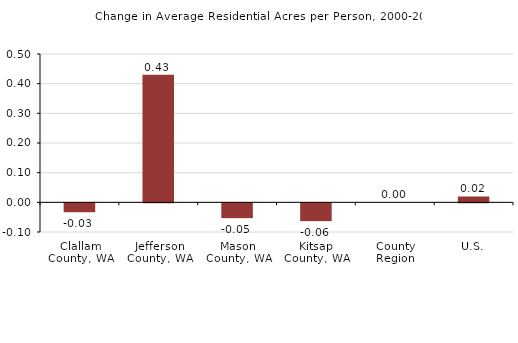
| Category | Series 1 |
|---|---|
| Clallam County, WA | -0.03 |
| Jefferson County, WA | 0.43 |
| Mason County, WA | -0.05 |
| Kitsap County, WA | -0.06 |
| County Region | 0 |
| U.S. | 0.02 |